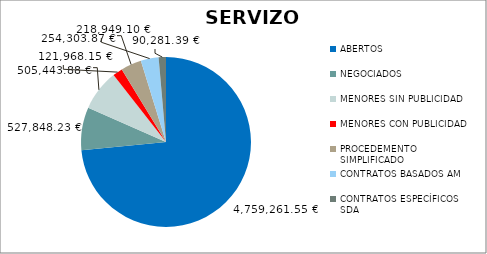
| Category | Series 0 |
|---|---|
| ABERTOS  | 4759261.55 |
| NEGOCIADOS  | 527848.23 |
| MENORES SIN PUBLICIDAD | 505443.88 |
| MENORES CON PUBLICIDAD | 121968.15 |
| PROCEDEMENTO SIMPLIFICADO | 254303.87 |
| CONTRATOS BASADOS AM | 218949.1 |
| CONTRATOS ESPECÍFICOS SDA | 90281.39 |